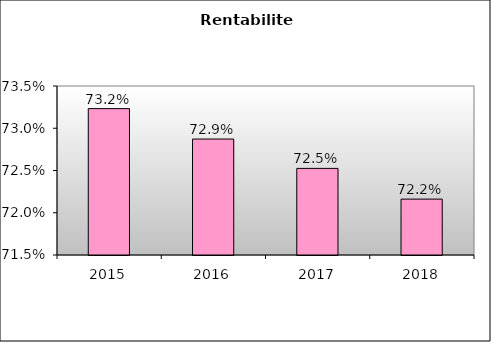
| Category | Series 0 |
|---|---|
| 2015.0 | 0.732 |
| 2016.0 | 0.729 |
| 2017.0 | 0.725 |
| 2018.0 | 0.722 |